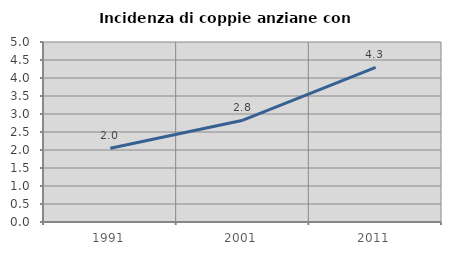
| Category | Incidenza di coppie anziane con figli |
|---|---|
| 1991.0 | 2.047 |
| 2001.0 | 2.828 |
| 2011.0 | 4.293 |